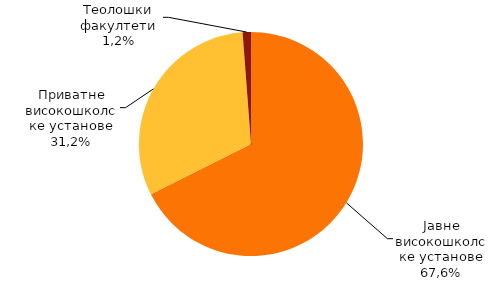
| Category | Column1 |
|---|---|
| јавне високошколске установе | 32701 |
| приватне високошколске установе | 15099 |
| теолошки факултети | 581 |